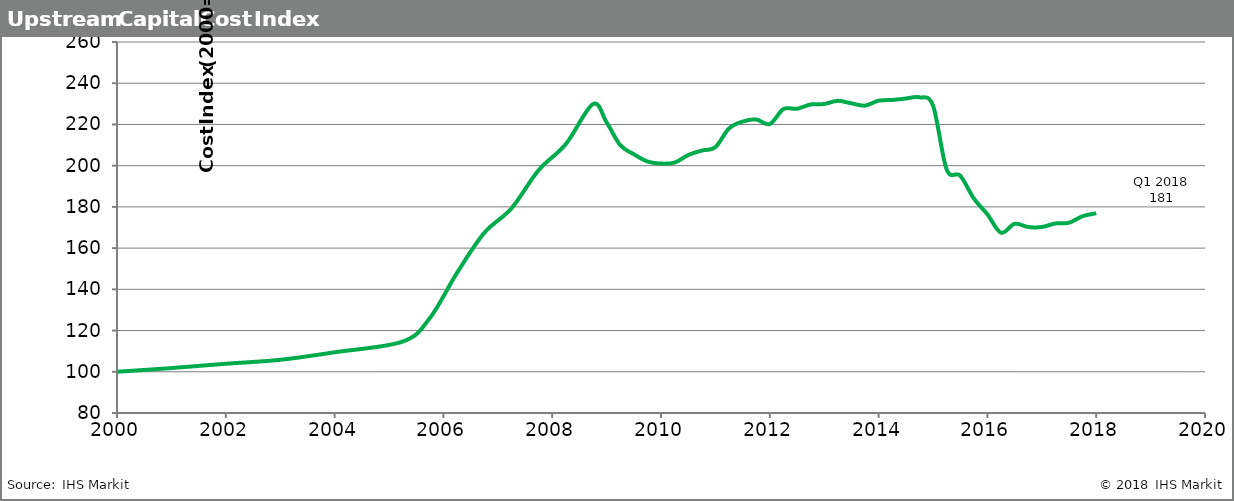
| Category | UCCI |
|---|---|
| 2000.0 | 100 |
| 2001.0 | 101.8 |
| 2002.0 | 103.9 |
| 2003.0 | 105.8 |
| 2004.0 | 109.462 |
| 2005.25 | 114.642 |
| 2005.75 | 126.023 |
| 2006.25 | 147.973 |
| 2006.75 | 167.369 |
| 2007.25 | 179.244 |
| 2007.75 | 197.8 |
| 2008.25 | 210.45 |
| 2008.75 | 229.896 |
| 2009.0 | 221 |
| 2009.25 | 210 |
| 2009.5 | 205.545 |
| 2009.75 | 202.036 |
| 2010.0 | 201.026 |
| 2010.25 | 201.483 |
| 2010.5 | 205.14 |
| 2010.75 | 207.332 |
| 2011.0 | 208.99 |
| 2011.25 | 218.06 |
| 2011.5 | 221.38 |
| 2011.75 | 222.425 |
| 2012.0 | 220.204 |
| 2012.25 | 227.445 |
| 2012.5 | 227.609 |
| 2012.75 | 229.683 |
| 2013.0 | 229.912 |
| 2013.25 | 231.471 |
| 2013.5 | 230.245 |
| 2013.75 | 229.132 |
| 2014.0 | 231.54 |
| 2014.25 | 231.871 |
| 2014.5 | 232.573 |
| 2014.75 | 233.169 |
| 2015.0 | 229.139 |
| 2015.25 | 198.243 |
| 2015.5 | 195.148 |
| 2015.75 | 184.075 |
| 2016.0 | 176.374 |
| 2016.25 | 167.468 |
| 2016.5 | 171.777 |
| 2016.75 | 170.234 |
| 2017.0 | 170.229 |
| 2017.25 | 171.948 |
| 2017.5 | 172.316 |
| 2017.75 | 175.477 |
| 2018.0 | 176.905 |